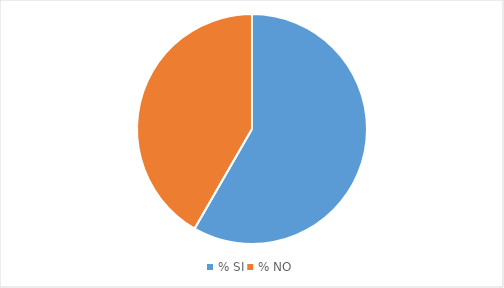
| Category | Series 0 | Series 1 | Series 2 | Series 3 | Series 4 | Series 5 | Series 6 | Series 7 | Series 8 |
|---|---|---|---|---|---|---|---|---|---|
| % SI | 4.73 | 6.76 | 6.08 | 5.41 | 4.05 | 4.73 | 6.76 | 7.43 | 7.43 |
| % NO | 3.38 | 4.05 | 2.7 | 8.78 | 5.41 | 10.14 | 6.08 | 3.38 | 2.7 |